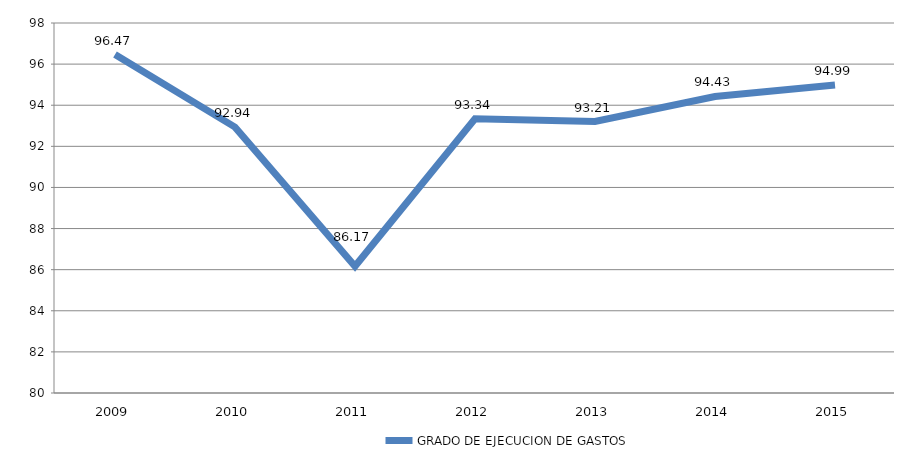
| Category | GRADO DE EJECUCION DE GASTOS |
|---|---|
| 2009.0 | 96.466 |
| 2010.0 | 92.936 |
| 2011.0 | 86.165 |
| 2012.0 | 93.343 |
| 2013.0 | 93.207 |
| 2014.0 | 94.427 |
| 2015.0 | 94.987 |